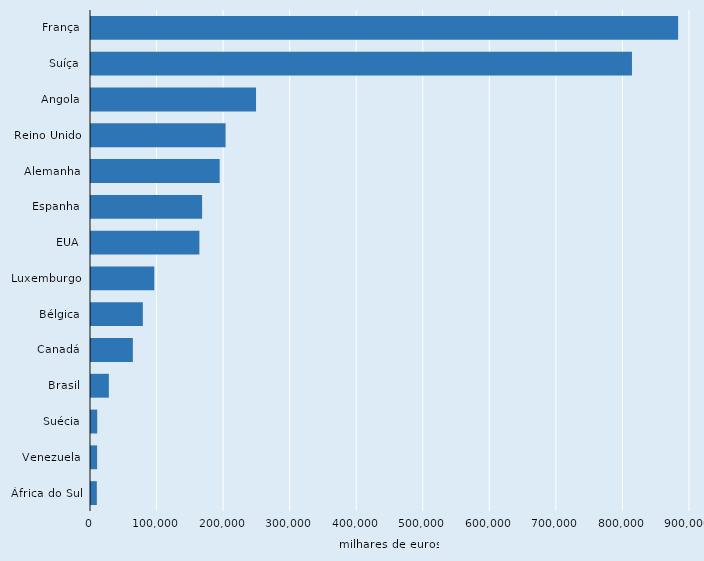
| Category | Series 2 |
|---|---|
| França | 882180 |
| Suíça | 812810 |
| Angola | 247960 |
| Reino Unido | 202220 |
| Alemanha | 193340 |
| Espanha | 166930 |
| EUA | 162860 |
| Luxemburgo | 95150 |
| Bélgica | 77900 |
| Canadá | 62890 |
| Brasil | 26830 |
| Suécia | 9340 |
| Venezuela | 9190 |
| África do Sul | 8760 |